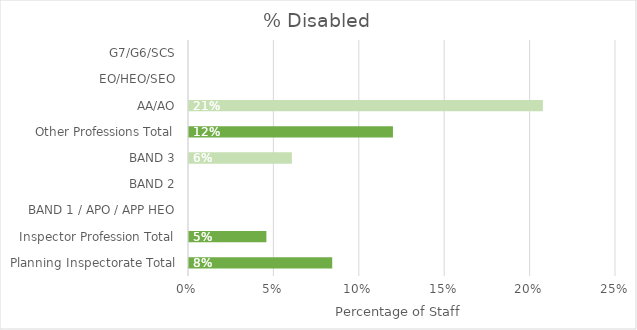
| Category | % Disabled |
|---|---|
| Planning Inspectorate Total | 0.084 |
| Inspector Profession Total | 0.045 |
| BAND 1 / APO / APP HEO | 0 |
| BAND 2 | 0 |
| BAND 3 | 0.06 |
| Other Professions Total | 0.119 |
| AA/AO | 0.207 |
| EO/HEO/SEO | 0 |
| G7/G6/SCS | 0 |